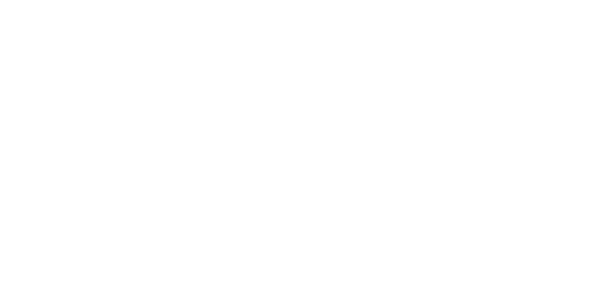
| Category | Series 0 |
|---|---|
| Pre-construction and enabling works | 0 |
| Substructure | 0 |
| Frame | 0 |
| Floors | 0 |
| Roof | 0 |
| Walls (internal and external) | 0 |
| Doors and windows | 0 |
| Finishes | 0 |
| FF&E | 0 |
| Building services and energy gen | 0 |
| Other | 0 |